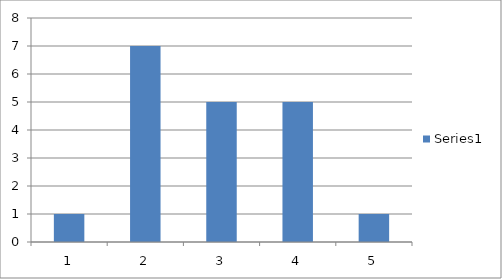
| Category | Series 0 |
|---|---|
| 0 | 1 |
| 1 | 7 |
| 2 | 5 |
| 3 | 5 |
| 4 | 1 |